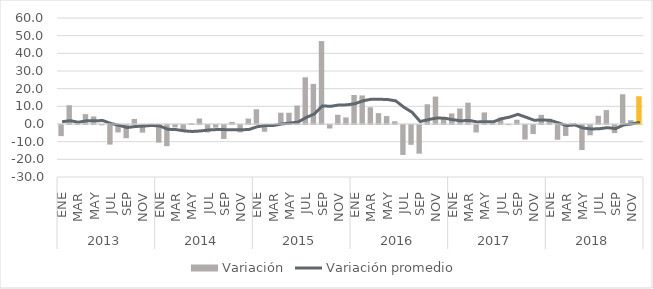
| Category | Variación |
|---|---|
| 0 | -6.295 |
| 1 | 10.631 |
| 2 | 0.445 |
| 3 | 5.601 |
| 4 | 4.298 |
| 5 | -0.168 |
| 6 | -11.099 |
| 7 | -4.2 |
| 8 | -7.487 |
| 9 | 2.882 |
| 10 | -4.332 |
| 11 | 0.037 |
| 12 | -9.969 |
| 13 | -11.98 |
| 14 | -1.348 |
| 15 | -3.394 |
| 16 | 0.419 |
| 17 | 3.104 |
| 18 | -4.221 |
| 19 | -1.491 |
| 20 | -7.89 |
| 21 | 1.207 |
| 22 | -4.18 |
| 23 | 3.075 |
| 24 | 8.326 |
| 25 | -3.816 |
| 26 | -0.758 |
| 27 | 6.38 |
| 28 | 6.373 |
| 29 | 10.459 |
| 30 | 26.428 |
| 31 | 22.716 |
| 32 | 46.942 |
| 33 | -1.976 |
| 34 | 5.23 |
| 35 | 3.703 |
| 36 | 16.417 |
| 37 | 16.184 |
| 38 | 9.457 |
| 39 | 6.146 |
| 40 | 4.497 |
| 41 | 1.547 |
| 42 | -16.951 |
| 43 | -11.214 |
| 44 | -16.237 |
| 45 | 11.173 |
| 46 | 15.528 |
| 47 | 3.095 |
| 48 | 5.995 |
| 49 | 8.76 |
| 50 | 12.037 |
| 51 | -4.233 |
| 52 | 6.559 |
| 53 | 0.673 |
| 54 | 3.705 |
| 55 | -0.075 |
| 56 | 2.398 |
| 57 | -8.223 |
| 58 | -5.142 |
| 59 | 5.193 |
| 60 | 2.943 |
| 61 | -8.361 |
| 62 | -6.195 |
| 63 | 0.148 |
| 64 | -14.14 |
| 65 | -5.82 |
| 66 | 4.656 |
| 67 | 7.867 |
| 68 | -4.579 |
| 69 | 16.833 |
| 70 | 2.169 |
| 71 | 15.705 |